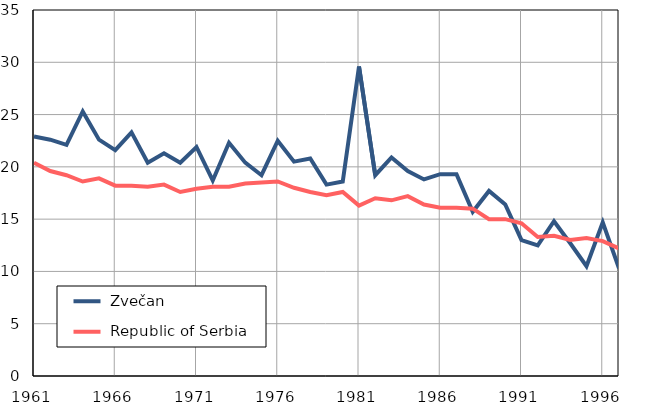
| Category |  Zvečan |  Republic of Serbia |
|---|---|---|
| 1961.0 | 22.9 | 20.4 |
| 1962.0 | 22.6 | 19.6 |
| 1963.0 | 22.1 | 19.2 |
| 1964.0 | 25.3 | 18.6 |
| 1965.0 | 22.6 | 18.9 |
| 1966.0 | 21.6 | 18.2 |
| 1967.0 | 23.3 | 18.2 |
| 1968.0 | 20.4 | 18.1 |
| 1969.0 | 21.3 | 18.3 |
| 1970.0 | 20.4 | 17.6 |
| 1971.0 | 21.9 | 17.9 |
| 1972.0 | 18.7 | 18.1 |
| 1973.0 | 22.3 | 18.1 |
| 1974.0 | 20.4 | 18.4 |
| 1975.0 | 19.2 | 18.5 |
| 1976.0 | 22.5 | 18.6 |
| 1977.0 | 20.5 | 18 |
| 1978.0 | 20.8 | 17.6 |
| 1979.0 | 18.3 | 17.3 |
| 1980.0 | 18.6 | 17.6 |
| 1981.0 | 29.6 | 16.3 |
| 1982.0 | 19.2 | 17 |
| 1983.0 | 20.9 | 16.8 |
| 1984.0 | 19.6 | 17.2 |
| 1985.0 | 18.8 | 16.4 |
| 1986.0 | 19.3 | 16.1 |
| 1987.0 | 19.3 | 16.1 |
| 1988.0 | 15.7 | 16 |
| 1989.0 | 17.7 | 15 |
| 1990.0 | 16.4 | 15 |
| 1991.0 | 13 | 14.6 |
| 1992.0 | 12.5 | 13.3 |
| 1993.0 | 14.8 | 13.4 |
| 1994.0 | 12.7 | 13 |
| 1995.0 | 10.5 | 13.2 |
| 1996.0 | 14.7 | 12.9 |
| 1997.0 | 10.3 | 12.2 |